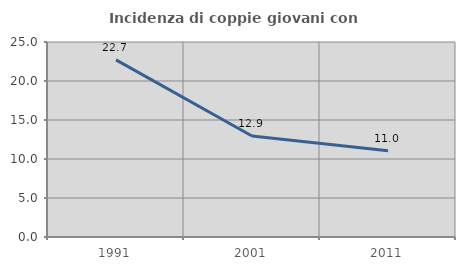
| Category | Incidenza di coppie giovani con figli |
|---|---|
| 1991.0 | 22.714 |
| 2001.0 | 12.946 |
| 2011.0 | 11.048 |